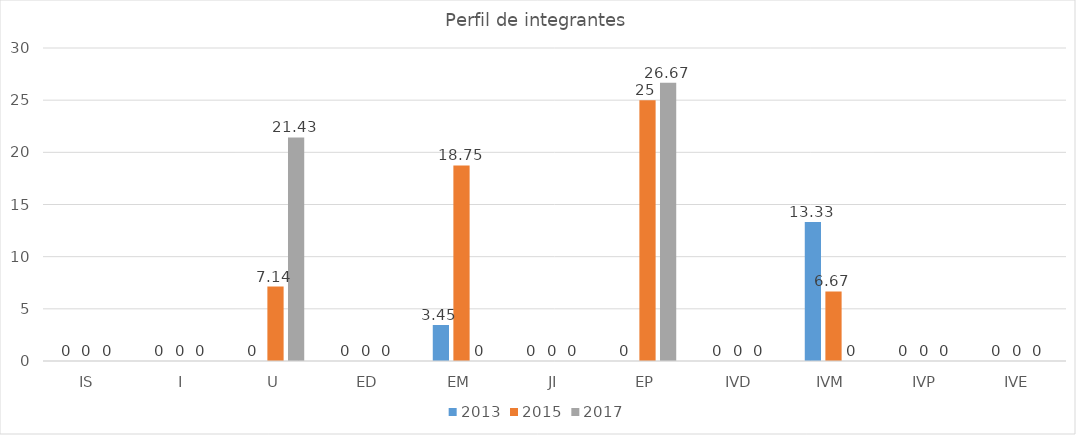
| Category | 2013 | 2015 | 2017 |
|---|---|---|---|
| IS | 0 | 0 | 0 |
| I | 0 | 0 | 0 |
| U | 0 | 7.14 | 21.43 |
| ED | 0 | 0 | 0 |
| EM | 3.45 | 18.75 | 0 |
| JI | 0 | 0 | 0 |
| EP | 0 | 25 | 26.67 |
| IVD | 0 | 0 | 0 |
| IVM | 13.33 | 6.67 | 0 |
| IVP | 0 | 0 | 0 |
| IVE | 0 | 0 | 0 |